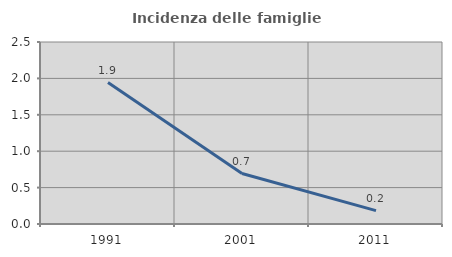
| Category | Incidenza delle famiglie numerose |
|---|---|
| 1991.0 | 1.943 |
| 2001.0 | 0.693 |
| 2011.0 | 0.184 |